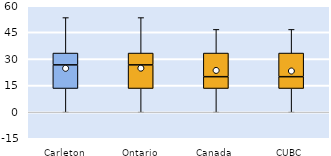
| Category | 25th | 50th | 75th |
|---|---|---|---|
| Carleton | 13.333 | 13.333 | 6.667 |
| Ontario | 13.333 | 13.333 | 6.667 |
| Canada | 13.333 | 6.667 | 13.333 |
| CUBC | 13.333 | 6.667 | 13.333 |